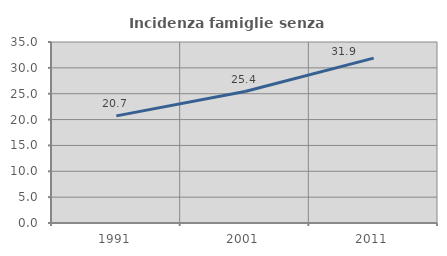
| Category | Incidenza famiglie senza nuclei |
|---|---|
| 1991.0 | 20.716 |
| 2001.0 | 25.416 |
| 2011.0 | 31.887 |